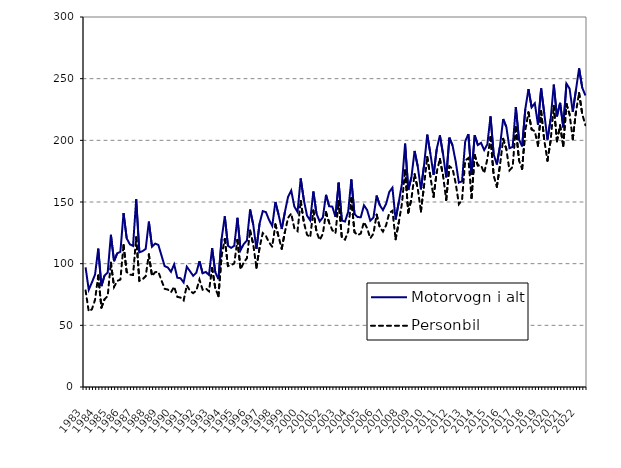
| Category | Motorvogn i alt | Personbil |
|---|---|---|
| 1983.0 | 97 | 78.3 |
| nan | 78.8 | 61.3 |
| nan | 84.8 | 63 |
| nan | 91.2 | 70.8 |
| 1984.0 | 112.2 | 90.4 |
| nan | 81.8 | 64.4 |
| nan | 90.4 | 71.1 |
| nan | 92.9 | 73.9 |
| 1985.0 | 123.4 | 100.8 |
| nan | 102 | 81.1 |
| nan | 108.4 | 86 |
| nan | 109.6 | 87.1 |
| 1986.0 | 141 | 115.2 |
| nan | 120.5 | 93.2 |
| nan | 115.7 | 91.1 |
| nan | 114.4 | 90.8 |
| 1987.0 | 152.2 | 121.3 |
| nan | 109.2 | 86.1 |
| nan | 110.1 | 87.3 |
| nan | 112 | 89.8 |
| 1988.0 | 134.1 | 107.5 |
| nan | 113.7 | 90 |
| nan | 116.3 | 93.1 |
| nan | 115.2 | 93.4 |
| 1989.0 | 106.6 | 86.4 |
| nan | 98 | 79.6 |
| nan | 96.9 | 79 |
| nan | 93.4 | 76.8 |
| 1990.0 | 99.4 | 81.3 |
| nan | 88.6 | 73.1 |
| nan | 88.2 | 72.5 |
| nan | 84.8 | 70.2 |
| 1991.0 | 97.5 | 82.4 |
| nan | 93.9 | 78 |
| nan | 90.2 | 76.1 |
| nan | 92.6 | 78.1 |
| 1992.0 | 102 | 87.1 |
| nan | 92.2 | 78.9 |
| nan | 93.3 | 79.9 |
| nan | 90.8 | 77.6 |
| 1993.0 | 112.6 | 96.5 |
| nan | 93 | 80.1 |
| nan | 87.5 | 73.6 |
| nan | 120.1 | 106.6 |
| 1994.0 | 138.4 | 120 |
| nan | 114.5 | 98.1 |
| nan | 112.8 | 98.8 |
| nan | 114.5 | 100.2 |
| 1995.0 | 137.2 | 119.3 |
| nan | 111 | 95.4 |
| nan | 115.9 | 101 |
| nan | 118.8 | 104.4 |
| 1996.0 | 143.9 | 126.9 |
| nan | 131.6 | 115.7 |
| nan | 112 | 96.7 |
| nan | 132.5 | 113.1 |
| 1997.0 | 142.6 | 124.8 |
| nan | 141.8 | 122.5 |
| nan | 135.4 | 117.3 |
| nan | 130.6 | 113.7 |
| 1998.0 | 150 | 131.9 |
| nan | 139.8 | 122 |
| nan | 128.1 | 112.1 |
| nan | 141.8 | 125.6 |
| 1999.0 | 154.2 | 137.1 |
| nan | 159.3 | 140.7 |
| nan | 146.3 | 128.7 |
| nan | 141.9 | 126.4 |
| 2000.0 | 169.1 | 150.9 |
| nan | 151.5 | 133.4 |
| nan | 139 | 123.5 |
| nan | 135.1 | 121.4 |
| 2001.0 | 158.5 | 143.1 |
| nan | 140.46 | 125.7 |
| nan | 134.24 | 119.2 |
| nan | 137.495 | 124.072 |
| 2002.0 | 155.814 | 141.724 |
| nan | 146.543 | 133.19 |
| nan | 146.231 | 127.141 |
| nan | 137.967 | 124.641 |
| 2003.0 | 165.679 | 150.811 |
| nan | 135.021 | 121.101 |
| nan | 134.111 | 119.491 |
| nan | 142.013 | 125.959 |
| 2004.0 | 168.309 | 153.043 |
| nan | 140.267 | 125.568 |
| nan | 137.77 | 123.121 |
| nan | 137.685 | 124.506 |
| 2005.0 | 147.311 | 133.756 |
| nan | 143.517 | 128.79 |
| nan | 134.783 | 120.571 |
| nan | 137.37 | 124.382 |
| 2006.0 | 155.213 | 139.728 |
| nan | 147.444 | 129.572 |
| nan | 143.451 | 126.006 |
| nan | 148.561 | 131.195 |
| 2007.0 | 158.1 | 141.084 |
| nan | 161.613 | 142.897 |
| nan | 135.821 | 119.753 |
| nan | 149.791 | 133.498 |
| 2008.0 | 164.642 | 148.614 |
| nan | 197.287 | 175.714 |
| nan | 159.718 | 141.407 |
| nan | 170.057 | 152.54 |
| 2009.0 | 191.38 | 172.559 |
| nan | 178.906 | 160.765 |
| nan | 160.234 | 142.312 |
| nan | 179.857 | 163.532 |
| 2010.0 | 204.636 | 186.507 |
| nan | 188.957 | 170.463 |
| nan | 172.077 | 154.156 |
| nan | 192.961 | 174.399 |
| 2011.0 | 204.005 | 184.86 |
| nan | 188.741 | 171.333 |
| nan | 169.934 | 151.694 |
| nan | 202.176 | 178.919 |
| 2012.0 | 195.829 | 177.072 |
| nan | 182.751 | 165.128 |
| nan | 165.73 | 148.242 |
| nan | 166.805 | 151.728 |
| 2013.0 | 199.181 | 183.653 |
| nan | 205.015 | 185.634 |
| nan | 172.044 | 153.21 |
| nan | 204.1 | 188.079 |
| 2014.0 | 196.177 | 179.552 |
| nan | 197.965 | 179.767 |
| nan | 192.105 | 173.474 |
| nan | 196.809 | 184.739 |
| 2015.0 | 219.419 | 202.592 |
| nan | 188.696 | 171.451 |
| nan | 180.388 | 162.297 |
| nan | 195.23 | 179.891 |
| 2016.0 | 217.298 | 201.197 |
| nan | 210.949 | 192.893 |
| nan | 193.648 | 175.642 |
| nan | 194.663 | 178.455 |
| 2017.0 | 227.029 | 210.738 |
| nan | 200.767 | 183.708 |
| nan | 195.059 | 176.766 |
| nan | 225.423 | 208.218 |
| 2018.0 | 241.528 | 222.678 |
| nan | 226.771 | 208.839 |
| nan | 230.044 | 207.395 |
| nan | 212.667 | 195.666 |
| 2019.0 | 242.056 | 223.584 |
| nan | 221.711 | 199.972 |
| nan | 200.668 | 183.518 |
| nan | 216.92 | 199.72 |
| 2020.0 | 245.163 | 227.947 |
| nan | 219.434 | 199.239 |
| nan | 230.409 | 212.039 |
| nan | 210.538 | 195.423 |
| 2021.0 | 246.037 | 229.482 |
| nan | 241.941 | 221.096 |
| nan | 223.162 | 200.95 |
| nan | 240.674 | 222.834 |
| 2022.0 | 258.319 | 238.379 |
| nan | 242.592 | 221.267 |
| nan | 236.373 | 212.275 |